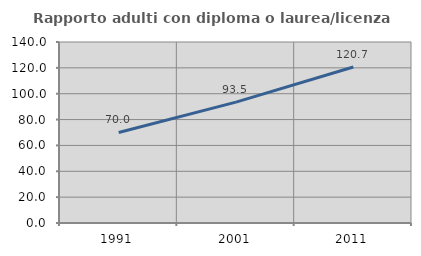
| Category | Rapporto adulti con diploma o laurea/licenza media  |
|---|---|
| 1991.0 | 70.044 |
| 2001.0 | 93.515 |
| 2011.0 | 120.659 |